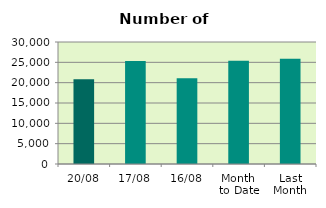
| Category | Series 0 |
|---|---|
| 20/08 | 20852 |
| 17/08 | 25318 |
| 16/08 | 21060 |
| Month 
to Date | 25374.143 |
| Last
Month | 25883.727 |